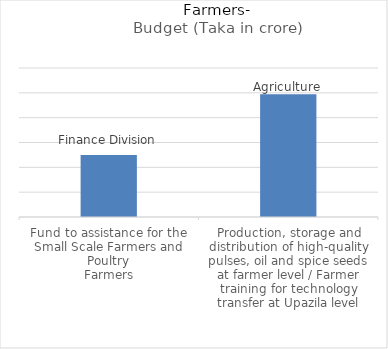
| Category | Budget (Taka in crore) |
|---|---|
| Fund to assistance for the Small Scale Farmers and Poultry
Farmers | 50 |
| Production, storage and distribution of high-quality pulses, oil and spice seeds at farmer level / Farmer training for technology
transfer at Upazila level | 98.87 |